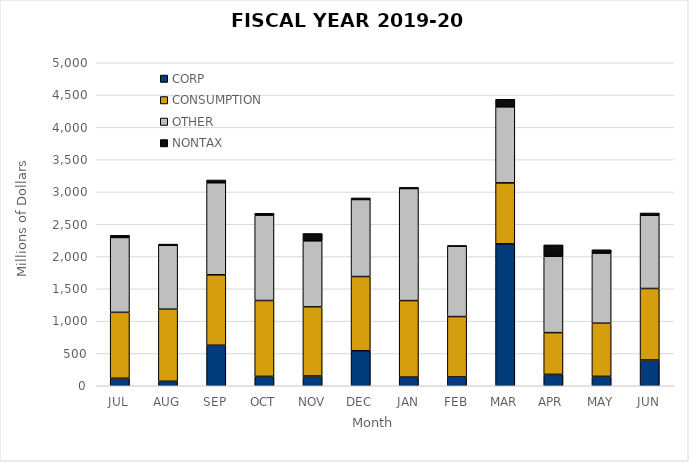
| Category | CORP | CONSUMPTION | OTHER | NONTAX |
|---|---|---|---|---|
| JUL | 116.935 | 1019.78 | 1158.456 | 33.983 |
| AUG | 68.96 | 1116.424 | 989.626 | 17.9 |
| SEP | 627.199 | 1090.291 | 1424.959 | 42.553 |
| OCT | 145.165 | 1174.468 | 1320.943 | 29.402 |
| NOV | 150.778 | 1070.044 | 1022.627 | 113.436 |
| DEC | 542.172 | 1148.656 | 1192.076 | 24.232 |
| JAN | 133.963 | 1184.383 | 1734.726 | 17.895 |
| FEB | 136.467 | 934.535 | 1091.412 | 5.133 |
| MAR | 2196.66 | 944.05 | 1177.018 | 117.123 |
| APR  | 176.324 | 646.146 | 1182.567 | 175.903 |
| MAY | 145.638 | 822.37 | 1085.666 | 51.895 |
| JUN | 398.746 | 1107.152 | 1133.472 | 35.476 |